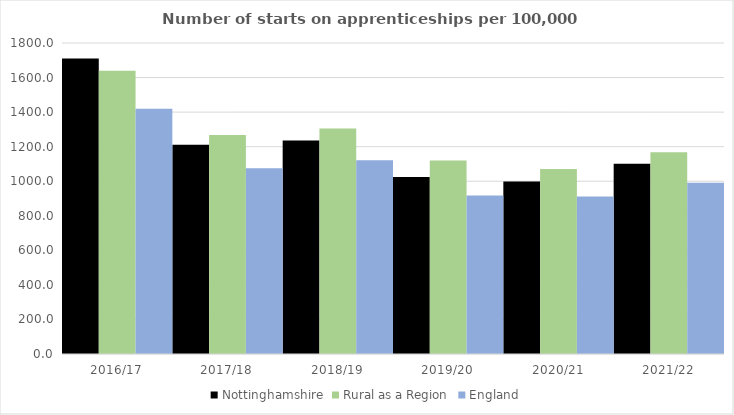
| Category | Nottinghamshire | Rural as a Region | England |
|---|---|---|---|
| 2016/17 | 1709.663 | 1638.789 | 1420 |
| 2017/18 | 1210.449 | 1267.474 | 1075 |
| 2018/19 | 1236.405 | 1304.57 | 1122 |
| 2019/20 | 1024.552 | 1119.662 | 918 |
| 2020/21 | 998.903 | 1070.748 | 912 |
| 2021/22 | 1100.544 | 1167.68 | 991 |